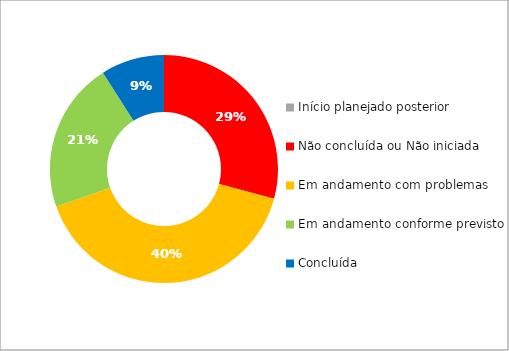
| Category | Series 0 |
|---|---|
| Início planejado posterior | 0 |
| Não concluída ou Não iniciada | 26 |
| Em andamento com problemas | 36 |
| Em andamento conforme previsto | 19 |
| Concluída | 8 |